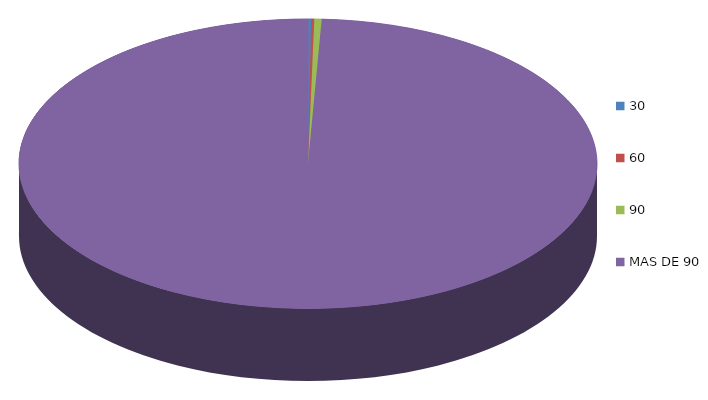
| Category | Series 0 | 74,749.8 |
|---|---|---|
| 30 | 74749.8 |  |
| 60 | 71716 |  |
| 90 | 172186.8 |  |
| MAS DE 90 | 41796382.5 |  |